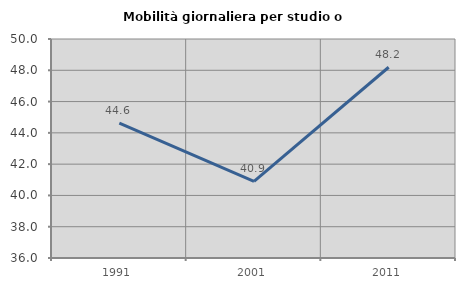
| Category | Mobilità giornaliera per studio o lavoro |
|---|---|
| 1991.0 | 44.626 |
| 2001.0 | 40.896 |
| 2011.0 | 48.194 |